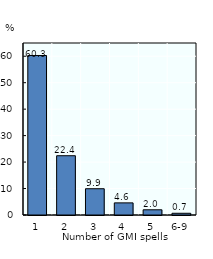
| Category | Series 0 |
|---|---|
| 1 | 60.28 |
| 2 | 22.4 |
| 3 | 9.93 |
| 4 | 4.58 |
| 5 | 1.97 |
| 6-9 | 0.65 |